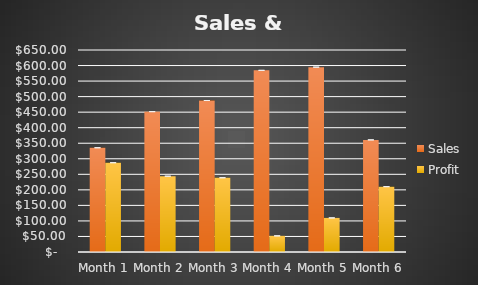
| Category | Sales | Profit |
|---|---|---|
| Month 1 | 335.48 | 287.37 |
| Month 2 | 451.61 | 243.99 |
| Month 3 | 487.47 | 238.97 |
| Month 4 | 584.5 | 51.96 |
| Month 5 | 594.88 | 109.71 |
| Month 6 | 360.77 | 210.29 |